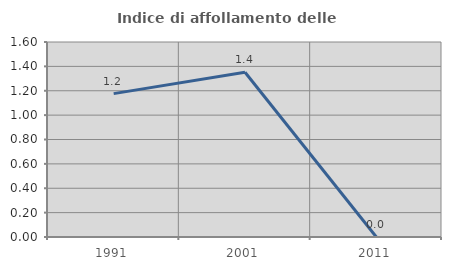
| Category | Indice di affollamento delle abitazioni  |
|---|---|
| 1991.0 | 1.176 |
| 2001.0 | 1.351 |
| 2011.0 | 0 |